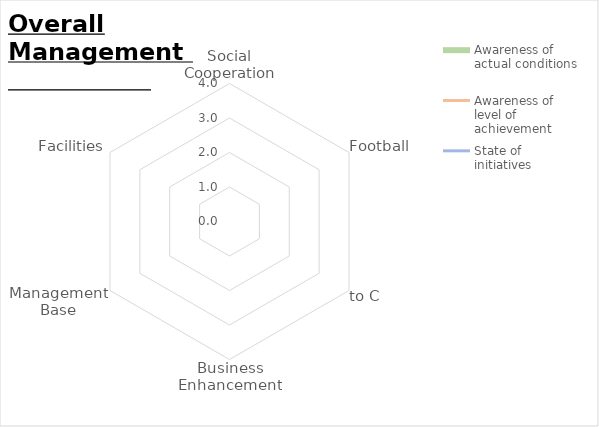
| Category | Awareness of actual conditions | Awareness of level of achievement | State of initiatives |
|---|---|---|---|
| Social Cooperation | 0 | 0 | 0 |
| Football | 0 | 0 | 0 |
| to C | 0 | 0 | 0 |
| Business Enhancement | 0 | 0 | 0 |
| Management Base | 0 | 0 | 0 |
| Facilities | 0 | 0 | 0 |